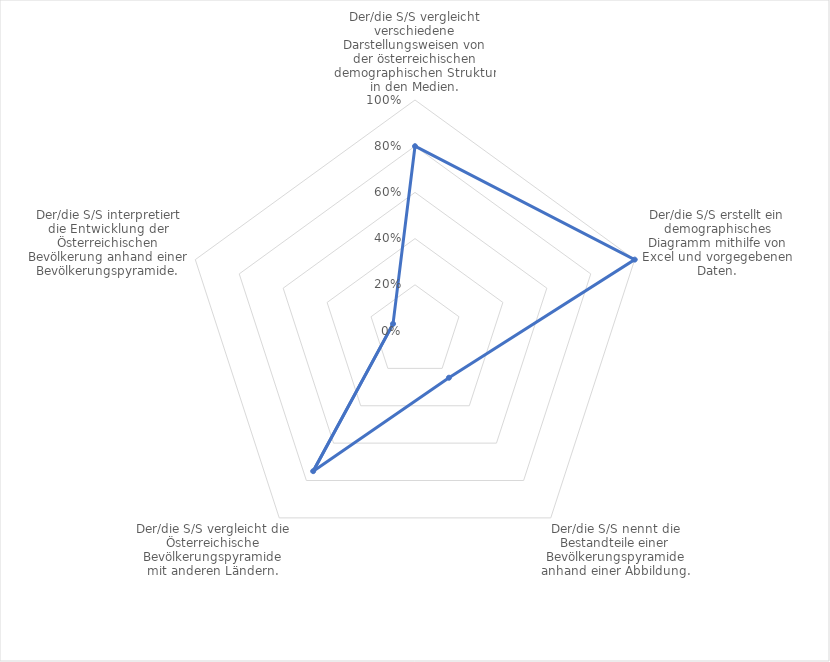
| Category | Series 0 |
|---|---|
| Der/die S/S vergleicht verschiedene Darstellungsweisen von der österreichischen demographischen Struktur in den Medien. | 0.8 |
| Der/die S/S erstellt ein demographisches Diagramm mithilfe von Excel und vorgegebenen Daten. | 1 |
| Der/die S/S nennt die Bestandteile einer Bevölkerungspyramide anhand einer Abbildung. | 0.25 |
| Der/die S/S vergleicht die Österreichische Bevölkerungspyramide mit anderen Ländern. | 0.75 |
| Der/die S/S interpretiert die Entwicklung der Österreichischen Bevölkerung anhand einer Bevölkerungspyramide. | 0.1 |